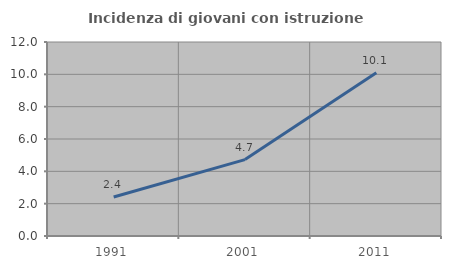
| Category | Incidenza di giovani con istruzione universitaria |
|---|---|
| 1991.0 | 2.415 |
| 2001.0 | 4.724 |
| 2011.0 | 10.101 |